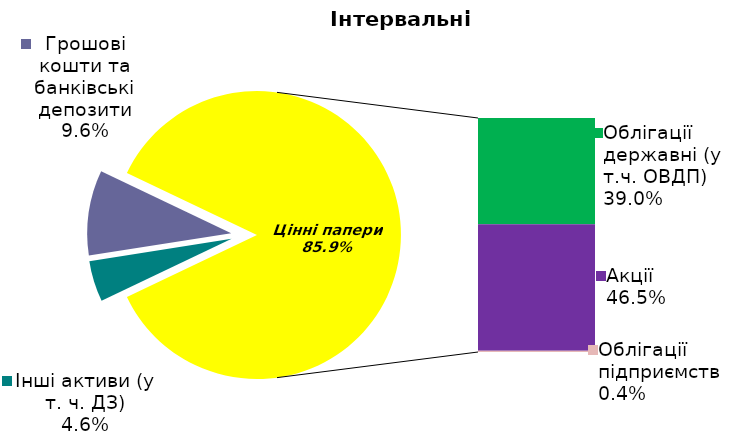
| Category | Series 0 |
|---|---|
| Інші активи (у т. ч. ДЗ) | 0.046 |
| Грошові кошти та банківські депозити | 0.096 |
| Банківські метали | 0 |
| Облігації державні (у т.ч. ОВДП) | 0.39 |
| Акції | 0.465 |
| Облігації підприємств | 0.004 |